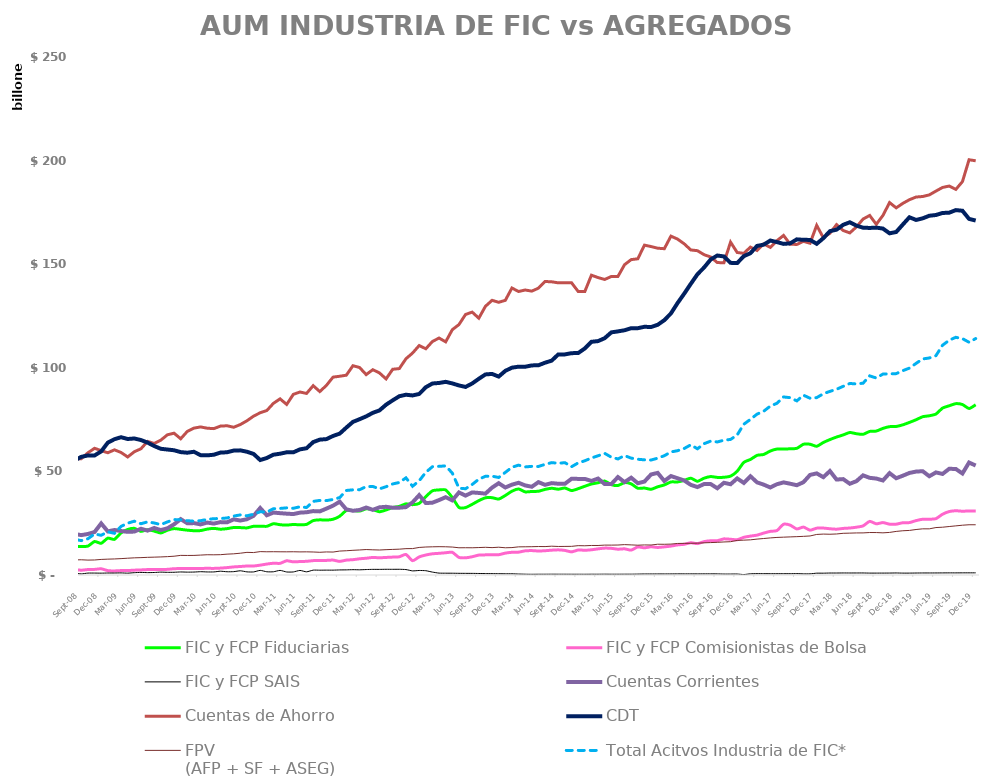
| Category | FIC y FCP Fiduciarias | FIC y FCP Comisionistas de Bolsa  | FIC y FCP SAIS | Cuentas Corrientes | Cuentas de Ahorro | CDT | FPV 
(AFP + SF + ASEG) | Total Acitvos Industria de FIC*  |
|---|---|---|---|---|---|---|---|---|
| 2008-01-01 | 12132808.79 | 2121832.26 | 544957.64 | 19249897.427 | 56056210.717 | 44941279.529 | 6945547.417 | 14799598.69 |
| 2008-02-01 | 12289879.65 | 2209666.7 | 519406.62 | 19213144.763 | 58419307.534 | 46482106.381 | 6986252.995 | 15018952.97 |
| 2008-03-01 | 12539377.12 | 2365642.48 | 580026.4 | 19370655.062 | 58209076.429 | 46770117.743 | 7003508.339 | 15485046 |
| 2008-04-01 | 12741364.47 | 2282972.94 | 561624.36 | 19492288.329 | 56874678.086 | 50148441.992 | 7150454.725 | 15585961.77 |
| 2008-05-01 | 12829643.03 | 2496281.61 | 662058.6 | 18663722.507 | 55639744.889 | 50761825.818 | 7208344.175 | 15987983.24 |
| 2008-06-01 | 12830951.12 | 2449742.03 | 701874.68 | 20003271.69 | 54847359.853 | 52034374.991 | 7166940.12 | 15982567.83 |
| 2008-07-01 | 13541278.95 | 2558464.4 | 754965.98 | 20342547.222 | 55678115.649 | 53125364.529 | 7175159.671 | 16854709.33 |
| 2008-08-01 | 13772968.36 | 2624403.07 | 815049.75 | 19770767.165 | 56148266.184 | 55348186.864 | 7294900.84 | 17212421.18 |
| 2008-09-01 | 13734669.578 | 2310280.49 | 544732.35 | 19250250.046 | 56145402.999 | 57015473.451 | 7349973.229 | 16589682.418 |
| 2008-10-01 | 13953414.868 | 2633334.91 | 921341.15 | 19804369.956 | 58986747.367 | 57700276.163 | 7188191.891 | 17508090.928 |
| 2008-11-01 | 16163521.832 | 2705717.241 | 932219.524 | 20735409.062 | 61155619.251 | 57692228.019 | 7246974.689 | 19801458.597 |
| 2008-12-01 | 15284899.058 | 2999156.471 | 891716.476 | 24887321.444 | 60019672.799 | 59648963.504 | 7516031.999 | 19175772.005 |
| 2009-01-01 | 17792239.172 | 2100542.66 | 962439.26 | 21040089.438 | 58999367.687 | 63877394.025 | 7647629.694 | 20855221.092 |
| 2009-02-01 | 17194217.152 | 1967140.68 | 956293.14 | 21714869.41 | 60405778.82 | 65534380.712 | 7751657.459 | 20117650.972 |
| 2009-03-01 | 20337363.88 | 2134644.38 | 1012448.54 | 21229406.812 | 59137277.4 | 66499801.412 | 7903642.968 | 23484456.8 |
| 2009-04-01 | 21958761.164 | 2138631.81 | 896627.12 | 20817553.96 | 56964966.372 | 65635299.329 | 8099376.93 | 24994020.094 |
| 2009-05-01 | 22513996.419 | 2336055.3 | 1121578.42 | 20961604.211 | 59492776.482 | 65895170.219 | 8286121.084 | 25971630.139 |
| 2009-06-01 | 21046486.068 | 2448437.58 | 1248642.13 | 22321940.134 | 60913043.271 | 65133059.461 | 8385600.015 | 24743565.778 |
| 2009-07-01 | 21871781.17 | 2623440.68 | 1149701.35 | 21420752.429 | 64486469.469 | 63910383.949 | 8522248.082 | 25644923.2 |
| 2009-08-01 | 21188789.878 | 2709594.68 | 1206713.71 | 22688223.969 | 63475807.938 | 62251898.303 | 8613906.771 | 25105098.268 |
| 2009-09-01 | 20280820.943 | 2658291.05 | 1386121.35 | 21673686.686 | 65073515.135 | 60908624.489 | 8719243.902 | 24325233.343 |
| 2009-10-01 | 21608487.093 | 2725247.27 | 1290257.29 | 22525547.45 | 67672284.07 | 60562742.887 | 8861759.81 | 25623991.653 |
| 2009-11-01 | 22396153.656 | 3044545.31 | 1317226.5 | 24455054.889 | 68440998.474 | 60197481.156 | 9068046.526 | 26757925.466 |
| 2009-12-01 | 22031134.901 | 3106700.35 | 1468565.02 | 26967356.932 | 65747994.242 | 59311640.164 | 9469304.205 | 26606400.271 |
| 2010-01-01 | 21639369.678 | 3179311.49 | 1383329.28 | 24954039.431 | 69305725.954 | 59022895.072 | 9433451.602 | 26202010.448 |
| 2010-02-01 | 21372785.209 | 3169119.85 | 1423495.84 | 25049574.137 | 70880759.204 | 59472247.066 | 9452309.941 | 25965400.899 |
| 2010-03-01 | 21434402.584 | 3174174.41 | 1594227.95 | 24420636.902 | 71469459.614 | 57851242.755 | 9611509.694 | 26202804.944 |
| 2010-04-01 | 22143243.751 | 3212727.75 | 1475837.14 | 25301982.328 | 70847211.96 | 57735039.025 | 9778654.214 | 26831808.641 |
| 2010-05-01 | 22503307.867 | 3190200.84 | 1483983.1 | 24812065.229 | 70645167.236 | 58048404.335 | 9744618.09 | 27177491.807 |
| 2010-06-01 | 22108087.545 | 3329038.91 | 1824933.45 | 25526414.201 | 71856536.453 | 59077438.758 | 9809143.264 | 27262059.905 |
| 2010-07-01 | 22375035.018 | 3572124.43 | 1568907.5 | 25422219.387 | 72032667.79 | 59235603.294 | 10060626.167 | 27516066.948 |
| 2010-08-01 | 22916586.47 | 3900515.32 | 1614182.63 | 26846242.145 | 71298447.382 | 60053578.291 | 10224850.699 | 28431284.42 |
| 2010-09-01 | 22872109.022 | 4099833.03 | 2037298.42 | 26290119.128 | 72611229.804 | 60156407.545 | 10513688.388 | 29009240.472 |
| 2010-10-01 | 22738234.3 | 4334389.78 | 1510252.83 | 26915819.282 | 74425012.581 | 59484867.202 | 10923089.827 | 28582876.91 |
| 2010-11-01 | 23509021.497 | 4340862.77 | 1483729.95 | 28542298.222 | 76665094.553 | 58441211.555 | 10834942.436 | 29333614.217 |
| 2010-12-01 | 23562424.684 | 4742999.64 | 2220193.91 | 32321078.595 | 78306142.612 | 55481322.699 | 11287314.204 | 30525618.234 |
| 2011-01-01 | 23495462.935 | 5289330.33 | 1556608.79 | 28820282.353 | 79376902.142 | 56468354.569 | 11207478.664 | 30341402.055 |
| 2011-02-01 | 24756664.566 | 5671618.52 | 1557593.58 | 30139906.351 | 82855125.664 | 58066057.51 | 11241368.84 | 31985876.666 |
| 2011-03-01 | 24274171.983 | 5632171 | 2217657.92 | 29838743.535 | 85010576 | 58536112.765 | 11202074.386 | 32124000.903 |
| 2011-04-01 | 24079345.463 | 6874755.37 | 1459776.52 | 29601505.07 | 82318818.989 | 59218987.736 | 11186753.753 | 32413877.353 |
| 2011-05-01 | 24377123.84 | 6341089.37 | 1476727.22 | 29409468.572 | 87172125.694 | 59206285.34 | 11220777.412 | 32194940.43 |
| 2011-06-01 | 24231078.42 | 6497028.02 | 2208092.5 | 30092330.237 | 88317380.74 | 60632244.817 | 11151147.79 | 32936198.94 |
| 2011-07-01 | 24434485.473 | 6608224.15 | 1531324.1 | 30282648.215 | 87627158.97 | 61184870.919 | 11176095.923 | 32574033.723 |
| 2011-08-01 | 26259447.52 | 6935490.17 | 2337915.55 | 30841103.551 | 91374682.8 | 64138804.274 | 11105936.296 | 35532853.24 |
| 2011-09-01 | 26623402.24 | 7041608 | 2322454.44 | 30699988.434 | 88529234.728 | 65335826.716 | 10964113.148 | 35987464.68 |
| 2011-10-01 | 26508006.996 | 7048002.36 | 2350293.45 | 32047983.66 | 91517505.226 | 65586962.022 | 11133132.15 | 35906302.806 |
| 2011-11-01 | 26909737.637 | 7192733.79 | 2342058.33 | 33456111.369 | 95502293.755 | 67109432.547 | 11074843.165 | 36444529.757 |
| 2011-12-01 | 28364982 | 6564786 | 2446719 | 35393548 | 95919744 | 68235861 | 11546595.74 | 37376487 |
| 2012-01-01 | 31131719 | 7180505 | 2478839 | 31668037.398 | 96429813.54 | 71134244.387 | 11708431.684 | 40791063 |
| 2012-02-01 | 31147275 | 7394169 | 2567975 | 31007469.335 | 101002712.63 | 73897067.082 | 11919293.346 | 41109419 |
| 2012-03-01 | 30833181 | 7823743 | 2510077 | 31372893 | 100150619 | 75192619 | 12082910.478 | 41167001 |
| 2012-04-01 | 31932047.65 | 8092229 | 2636558 | 32563742.234 | 96711407.203 | 76553414.137 | 12289106.986 | 42660834.65 |
| 2012-05-01 | 31562405.39 | 8467811 | 2716675 | 31445716.846 | 99087467.96 | 78272819.151 | 12156412.148 | 42746891.39 |
| 2012-06-01 | 30524721 | 8309508 | 2714337 | 32652205 | 97535090 | 79427656 | 12058126.88 | 41548566 |
| 2012-07-01 | 31384745 | 8476043 | 2753609 | 32914215.201 | 94633321.372 | 82178131.299 | 12231491.476 | 42614397 |
| 2012-08-01 | 32556264.125 | 8636341.39 | 2741827.01 | 32473082.673 | 99284188.863 | 84293159.574 | 12345156.611 | 43934432.525 |
| 2012-09-01 | 33120247 | 8786891 | 2754338 | 32485301.148 | 99622220.756 | 86273608.494 | 12470152.972 | 44661476 |
| 2012-10-01 | 34338711 | 9924835 | 2621952 | 32757672.42 | 104358590.858 | 87001274.106 | 12720740.166 | 46885498 |
| 2012-11-01 | 33938618 | 6897363 | 1988330 | 35055250.43 | 107111414.949 | 86660359.79 | 12745871.11 | 42824311 |
| 2012-12-01 | 34561616 | 8728627 | 2179791 | 38535455.952 | 110750588.805 | 87369641.716 | 13299299.104 | 45470034 |
| 2013-01-01 | 37836891 | 9651351 | 2068186 | 34709885.184 | 109182797.981 | 90615049.292 | 13509250.551 | 49556428 |
| 2013-02-01 | 40632956.33 | 10231474 | 1400201 | 34899680.619 | 112707815.094 | 92434040.154 | 13607848.915 | 52264631.33 |
| 2013-03-01 | 41069868 | 10463859 | 912927 | 36164862.111 | 114356257.363 | 92680012.269 | 13671877.605 | 52446654 |
| 2013-04-01 | 41043734 | 10736529 | 867910 | 37556322.05 | 112533114.733 | 93226256.238 | 13626257.475 | 52648173 |
| 2013-05-01 | 37372662.65 | 10950463 | 857331 | 36017787.759 | 118386119.194 | 92468633.061 | 13484574.137 | 49180456.65 |
| 2013-06-01 | 32613179 | 8493261 | 808179 | 39842306.408 | 120861072.922 | 91484124.39 | 13139969.891 | 41914619 |
| 2013-07-01 | 32539415 | 8294683 | 794522 | 38314923.667 | 125752507.028 | 90763716.528 | 13164680.049 | 41628620 |
| 2013-08-01 | 34114942.963 | 8807642.89 | 778363.4 | 39857916.017 | 126871339.693 | 92441495.764 | 13138412.03 | 43700949.253 |
| 2013-09-01 | 35884012 | 9612656 | 733729 | 39603634.773 | 123946270.663 | 94694686.716 | 13248237.194 | 46230397 |
| 2013-10-01 | 37250894 | 9715070 | 678939 | 39272659.973 | 129674911.513 | 96800721.471 | 13368711.223 | 47644903 |
| 2013-11-01 | 37318372.93 | 9735967.95 | 660905.93 | 42179693.943 | 132565745.258 | 97042379.372 | 13213562.109 | 47715246.81 |
| 2013-12-01 | 36647206.822 | 9781706.51 | 627244.94 | 44300089.672 | 131616929.6 | 95773066.764 | 13412280.346 | 47056158.272 |
| 2014-01-01 | 38369903.334 | 10557268.53 | 595392.99 | 42230304 | 132558811 | 98518081 | 13141330.376 | 49522564.854 |
| 2014-02-01 | 40449101.764 | 10954202.7 | 588536.56 | 43599724.41 | 138509031.454 | 100065132.396 | 13233550.635 | 51991841.024 |
| 2014-03-01 | 41519630.114 | 11027301.95 | 470068.23 | 44500844.044 | 136817273.962 | 100541868.899 | 13584518.658 | 53017000.294 |
| 2014-04-01 | 40116498 | 11657872 | 385729 | 43231698.1 | 137554847.305 | 100516933.788 | 13615476.315 | 52160099 |
| 2014-05-01 | 40315151.32 | 11776989.97 | 345001.78 | 42585585.256 | 137008074.28 | 101154120.942 | 13660673.832 | 52437143.07 |
| 2014-06-01 | 40416098.89 | 11579961.3 | 371228.88 | 44817124.428 | 138429028.965 | 101220614.506 | 13743144.418 | 52367289.07 |
| 2014-07-01 | 41316797 | 11715729 | 375325 | 43521000 | 141652000 | 102464000 | 13715305.865 | 53407851 |
| 2014-08-01 | 41855731.708 | 11985721.68 | 391319.12 | 44347000 | 141508000 | 103457000 | 13905242.744 | 54232772.508 |
| 2014-09-01 | 41411891.289 | 12137558.48 | 380927.6 | 44025212.782 | 141003775.677 | 106475441.817 | 13762483.464 | 53930377.369 |
| 2014-10-01 | 41975634 | 11856857 | 377516 | 44025212.782 | 141003775.677 | 106475441.817 | 13795830.272 | 54210007 |
| 2014-11-01 | 40740001.671 | 11158123 | 368897 | 46462368.859 | 141050657.705 | 107070411.692 | 13829598.92 | 52267021.671 |
| 2014-12-01 | 41656654.292 | 12075430.7 | 368901.58 | 46381000 | 136815000 | 107117082.017 | 14167694.014 | 54100986.572 |
| 2015-01-01 | 42829367 | 11943981 | 361106 | 46380640.852 | 136815012.002 | 109331074.058 | 14105770.897 | 55134454 |
| 2015-02-01 | 43906014 | 12174662 | 377946 | 45389931.566 | 144696890.023 | 112547249.862 | 14245271.387 | 56458622 |
| 2015-03-01 | 44527590 | 12624685 | 373755 | 46556394.03 | 143546680.679 | 112885686.92 | 14238413.855 | 57526030 |
| 2015-04-01 | 45347838 | 12968209 | 400026 | 43882131.877 | 142640978.203 | 114295912.468 | 14432998.432 | 58716073 |
| 2015-05-01 | 43602206.437 | 12870169 | 379934 | 43868330.885 | 144067660.411 | 117095747.48 | 14423377.487 | 56852309.437 |
| 2015-06-01 | 43184659.116 | 12456297 | 378882 | 47269216.705 | 144099449.315 | 117576199.725 | 14467508.121 | 56019838.116 |
| 2015-07-01 | 44614821.846 | 12629777 | 394228 | 44824893.119 | 149762182.064 | 118118438.808 | 14663702.588 | 57638826.846 |
| 2015-08-01 | 43989076.157 | 12009130 | 397232 | 46961211.638 | 152216129.231 | 119114602.082 | 14529265.46 | 56395438.157 |
| 2015-09-01 | 41857276.437 | 13554913 | 440374 | 44277600.072 | 152612486.174 | 119116749.002 | 14379522.061 | 55852563.437 |
| 2015-10-01 | 41966985 | 13118659.51 | 501533 | 45094005.049 | 159196192.021 | 119793024.514 | 14509464.447 | 55587177.51 |
| 2015-11-01 | 41365255 | 13619238 | 502481 | 48513369.195 | 158519924.955 | 119681100.359 | 14468322.769 | 55486974 |
| 2015-12-01 | 42558876.345 | 13300169 | 516569 | 49285505.594 | 157725448.27 | 120756047.93 | 14848609.659 | 56375614.345 |
| 2016-01-01 | 43472183 | 13579289 | 517684 | 45368735.999 | 157475605.492 | 122975254.619 | 14825068.35 | 57569156 |
| 2016-02-01 | 44904961.572 | 13948131 | 526504 | 47744020.678 | 163541609.018 | 126254546.723 | 14915465.741 | 59379596.572 |
| 2016-03-01 | 44921377.27 | 14526538 | 551021 | 46707243.646 | 162117145.793 | 131244339.223 | 15223556.252 | 59998936.27 |
| 2016-04-01 | 45667420 | 14828090 | 550022 | 45621999.683 | 159833273.331 | 135771123.5 | 15263360.655 | 61045532 |
| 2016-05-01 | 46726726.617 | 15560816 | 551107 | 43514447.944 | 156878031.239 | 140527045.012 | 15313185.27 | 62838649.617 |
| 2016-06-01 | 45222447.609 | 15141673 | 547564 | 42434113.352 | 156521975.202 | 145130344.445 | 15357677.844 | 60911684.609 |
| 2016-07-01 | 46710606.529 | 16108722 | 553440 | 43891948.187 | 154596652.035 | 148404415.743 | 15528129.989 | 63372768.529 |
| 2016-08-01 | 47512415 | 16527322 | 562941 | 43890420.74 | 153476072.003 | 152277396.699 | 15646521.009 | 64602678 |
| 2016-09-01 | 47102022.877 | 16559309 | 549077 | 41863341.532 | 150778144.586 | 154187082.647 | 15773427.906 | 64210408.877 |
| 2016-10-01 | 47168514.542 | 17435641 | 460432 | 44505224.349 | 150721044.65 | 153731885.974 | 15947295.967 | 65064587.542 |
| 2016-11-01 | 47718064 | 17243897 | 464614 | 43803723.471 | 160646159.221 | 150647315.539 | 16070122.225 | 65426575 |
| 2016-12-01 | 50077108.765 | 17024827 | 481553 | 46616292.021 | 155649773.745 | 150549237.17 | 16686648.639 | 67583488.765 |
| 2017-01-01 | 54368178.505 | 18181608 | 222152 | 44442010.194 | 155244726.496 | 153886811.688 | 16818695.993 | 72771938.505 |
| 2017-02-01 | 55762190.181 | 18776174.177 | 579714.85 | 47657415.777 | 158251548.569 | 155310289.15 | 16972857.277 | 75118079.208 |
| 2017-03-01 | 57747289.049 | 19241862.357 | 655367.902 | 44697365.002 | 156647290.937 | 158821173.031 | 17322864.933 | 77644519.308 |
| 2017-04-01 | 58164520 | 20227683 | 641508 | 43616908.455 | 159780567.33 | 159434119.369 | 17610744.228 | 79033711 |
| 2017-05-01 | 59841564 | 21050779 | 628347 | 42239864.757 | 158115214.364 | 161414965.04 | 17897354.211 | 81520690 |
| 2017-06-01 | 60786454.012 | 21451129.062 | 628314.626 | 43810127.154 | 161349013.039 | 160671195.131 | 18136078.113 | 82865897.7 |
| 2017-07-01 | 60816180.783 | 24476364.089 | 632988.556 | 44691718.554 | 163885549.644 | 159803990.507 | 18261453.112 | 85925533.428 |
| 2017-08-01 | 60902525 | 24058592 | 631625 | 44054660.814 | 159638000 | 160059000 | 18386706.881 | 85592742 |
| 2017-09-01 | 61127629 | 22219060 | 673578 | 43330054.008 | 159527528.2 | 161996651.348 | 18508890.927 | 84020267 |
| 2017-10-01 | 63105115.683 | 23122990 | 561905 | 44789028.673 | 161040018.386 | 161758053.274 | 18651311.322 | 86790010.683 |
| 2017-11-01 | 63102535 | 21640090 | 566184 | 48308003.562 | 160113329.651 | 161726673.163 | 18839024.719 | 85308809 |
| 2017-12-01 | 62127325 | 22603730 | 875331 | 49040782.522 | 168742902.483 | 159841329.569 | 19576385.715 | 85606386 |
| 2018-01-01 | 63938242 | 22648623 | 879678 | 47216931.732 | 162781465.049 | 162535157.785 | 19748025.204 | 87466543 |
| 2018-02-01 | 65357837 | 22320847 | 950750 | 50174200.241 | 164930800.368 | 165943798.481 | 19669969.384 | 88629434 |
| 2018-03-01 | 66580958 | 22111577 | 954371 | 46064458.079 | 169103161.446 | 166672653.203 | 19802479.283 | 89646906 |
| 2018-04-01 | 67605714 | 22478848 | 983710 | 46287698.831 | 166258678.919 | 169010131.166 | 20119796.013 | 91068272 |
| 2018-05-01 | 68783686 | 22674488 | 970461 | 44034361.721 | 165106317.223 | 170232145.256 | 20203862.672 | 92428635 |
| 2018-06-01 | 68179383 | 23064433 | 977571 | 45282598.338 | 167988914.573 | 168605713.635 | 20307291.936 | 92221387 |
| 2018-07-01 | 67891332.876 | 23695065 | 981550 | 48090725.791 | 171789954.916 | 167623407.946 | 20321726.758 | 92567947.876 |
| 2018-08-01 | 69290394.916 | 25889867 | 916282 | 46892865.731 | 173528210.847 | 167494515.744 | 20496962.068 | 96096543.916 |
| 2018-09-01 | 69468408 | 24695139 | 918203 | 46545235.243 | 169253761.111 | 167650153.722 | 20484787.245 | 95081750 |
| 2018-10-01 | 70752372.545 | 25303024 | 923856 | 45619808.862 | 173540048.109 | 167193109.497 | 20349410.39 | 96979252.545 |
| 2018-11-01 | 71596777 | 24525057 | 936854 | 49168133.858 | 179733646.903 | 164906615.194 | 20551807.323 | 97058688 |
| 2018-12-01 | 71679839 | 24525616 | 982589 | 46701780.579 | 177202446.744 | 165546553.572 | 21038534.051 | 97188044 |
| 2019-01-01 | 72479982 | 25224946 | 913635 | 47919007.538 | 179357673.563 | 169137227.662 | 21352471.029 | 98618563 |
| 2019-02-01 | 73642869 | 25291314 | 915329 | 49251446.721 | 181126226.127 | 172655618.131 | 21509245.731 | 99849512 |
| 2019-03-01 | 74925058 | 26249781 | 953344 | 49915673.748 | 182418243.406 | 171353531.629 | 21952152 | 102128183 |
| 2019-04-01 | 76387191 | 26901659 | 984140 | 50098154.109 | 182670636.205 | 172132365.456 | 22277971 | 104272990 |
| 2019-05-01 | 76851157.52 | 26901659 | 984140 | 47668839.935 | 183449047.246 | 173388676.147 | 22277971 | 104736956.52 |
| 2019-06-01 | 77670420 | 27188020 | 990243 | 49503365.541 | 185288152.785 | 173744511.023 | 22897709 | 105848683 |
| 2019-07-01 | 80565138.336 | 29333372 | 1008806 | 48777078.865 | 187040794.645 | 174724088.504 | 23064609 | 110907316.336 |
| 2019-08-01 | 81665926 | 30619880 | 1026967 | 51259181.407 | 187718162.039 | 174863760.82 | 23392445 | 113312773 |
| 2019-09-01 | 82690421 | 31003788 | 1024257 | 51167798.313 | 186094828.693 | 176108385.563 | 23715691 | 114718466 |
| 2019-10-01 | 82266738 | 30781025 | 1039920 | 48995503.076 | 189857556.141 | 175798830.418 | 24030558 | 114087683 |
| 2019-11-01 | 80353973 | 30911689 | 1047092 | 54284893.549 | 200422018.163 | 171857691.006 | 24244735 | 112312754 |
| 2019-12-01 | 82151903.071 | 30911689 | 1047092 | 52830252.44 | 199894729.527 | 171064162.485 | 24244735 | 114110684.071 |